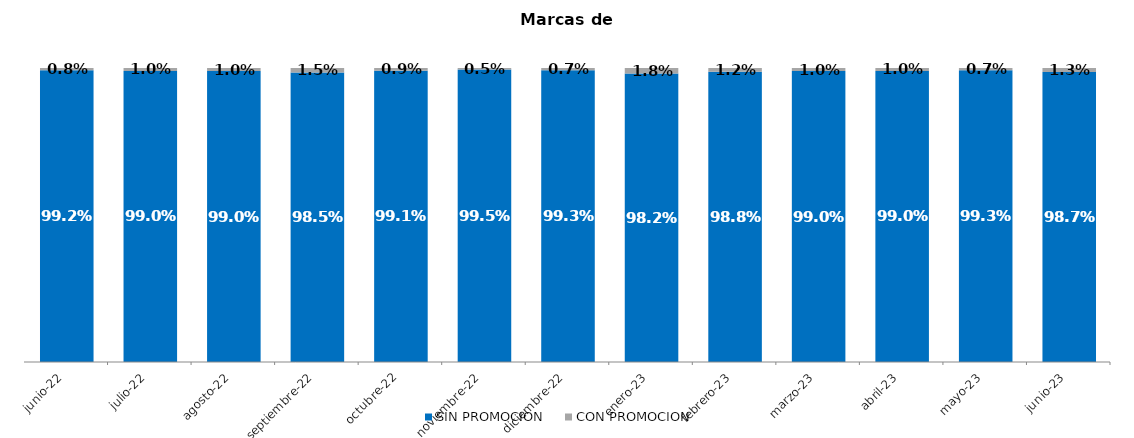
| Category | SIN PROMOCION   | CON PROMOCION   |
|---|---|---|
| 2022-06-01 | 0.992 | 0.008 |
| 2022-07-01 | 0.99 | 0.01 |
| 2022-08-01 | 0.99 | 0.01 |
| 2022-09-01 | 0.985 | 0.015 |
| 2022-10-01 | 0.991 | 0.009 |
| 2022-11-01 | 0.995 | 0.005 |
| 2022-12-01 | 0.993 | 0.007 |
| 2023-01-01 | 0.982 | 0.018 |
| 2023-02-01 | 0.988 | 0.012 |
| 2023-03-01 | 0.99 | 0.01 |
| 2023-04-01 | 0.99 | 0.01 |
| 2023-05-01 | 0.993 | 0.007 |
| 2023-06-01 | 0.987 | 0.013 |